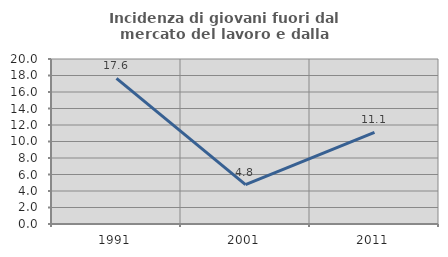
| Category | Incidenza di giovani fuori dal mercato del lavoro e dalla formazione  |
|---|---|
| 1991.0 | 17.647 |
| 2001.0 | 4.762 |
| 2011.0 | 11.111 |